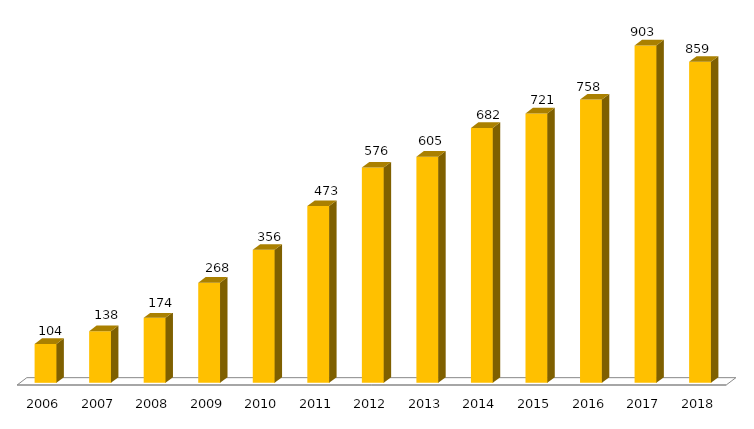
| Category | Programa |
|---|---|
| 2006.0 | 104 |
| 2007.0 | 138 |
| 2008.0 | 174 |
| 2009.0 | 268 |
| 2010.0 | 356 |
| 2011.0 | 473 |
| 2012.0 | 576 |
| 2013.0 | 605 |
| 2014.0 | 682 |
| 2015.0 | 721 |
| 2016.0 | 758 |
| 2017.0 | 903 |
| 2018.0 | 859 |